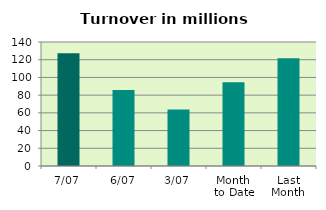
| Category | Series 0 |
|---|---|
| 7/07 | 127.39 |
| 6/07 | 85.698 |
| 3/07 | 63.778 |
| Month 
to Date | 94.614 |
| Last
Month | 121.74 |